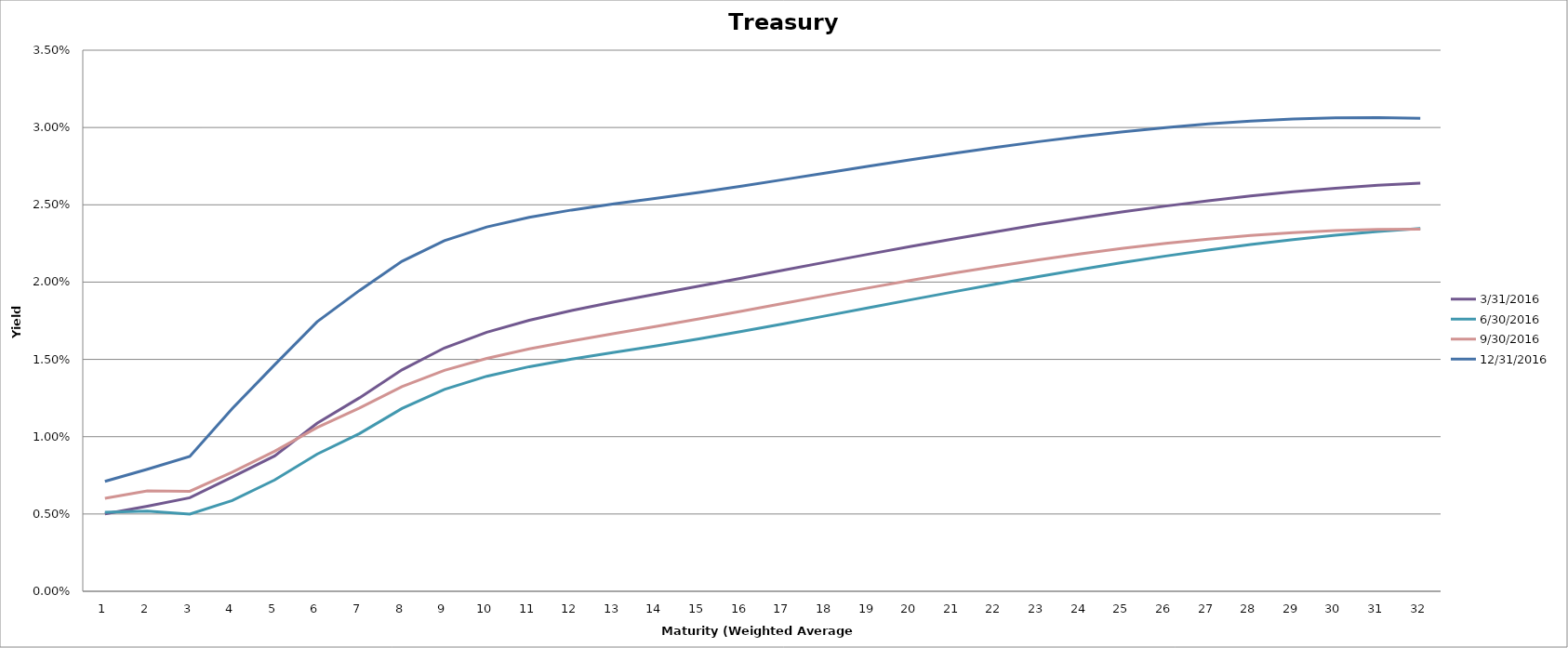
| Category | 3/31/2016 | 6/30/2016 | 9/30/2016 | 12/31/2016 |
|---|---|---|---|---|
| 0 | 0.005 | 0.005 | 0.006 | 0.007 |
| 1 | 0.006 | 0.005 | 0.007 | 0.008 |
| 2 | 0.006 | 0.005 | 0.006 | 0.009 |
| 3 | 0.007 | 0.006 | 0.008 | 0.012 |
| 4 | 0.009 | 0.007 | 0.009 | 0.015 |
| 5 | 0.011 | 0.009 | 0.011 | 0.017 |
| 6 | 0.013 | 0.01 | 0.012 | 0.019 |
| 7 | 0.014 | 0.012 | 0.013 | 0.021 |
| 8 | 0.016 | 0.013 | 0.014 | 0.023 |
| 9 | 0.017 | 0.014 | 0.015 | 0.024 |
| 10 | 0.018 | 0.015 | 0.016 | 0.024 |
| 11 | 0.018 | 0.015 | 0.016 | 0.025 |
| 12 | 0.019 | 0.015 | 0.017 | 0.025 |
| 13 | 0.019 | 0.016 | 0.017 | 0.025 |
| 14 | 0.02 | 0.016 | 0.018 | 0.026 |
| 15 | 0.02 | 0.017 | 0.018 | 0.026 |
| 16 | 0.021 | 0.017 | 0.019 | 0.027 |
| 17 | 0.021 | 0.018 | 0.019 | 0.027 |
| 18 | 0.022 | 0.018 | 0.02 | 0.027 |
| 19 | 0.022 | 0.019 | 0.02 | 0.028 |
| 20 | 0.023 | 0.019 | 0.021 | 0.028 |
| 21 | 0.023 | 0.02 | 0.021 | 0.029 |
| 22 | 0.024 | 0.02 | 0.021 | 0.029 |
| 23 | 0.024 | 0.021 | 0.022 | 0.029 |
| 24 | 0.025 | 0.021 | 0.022 | 0.03 |
| 25 | 0.025 | 0.022 | 0.023 | 0.03 |
| 26 | 0.025 | 0.022 | 0.023 | 0.03 |
| 27 | 0.026 | 0.022 | 0.023 | 0.03 |
| 28 | 0.026 | 0.023 | 0.023 | 0.031 |
| 29 | 0.026 | 0.023 | 0.023 | 0.031 |
| 30 | 0.026 | 0.023 | 0.023 | 0.031 |
| 31 | 0.026 | 0.023 | 0.023 | 0.031 |